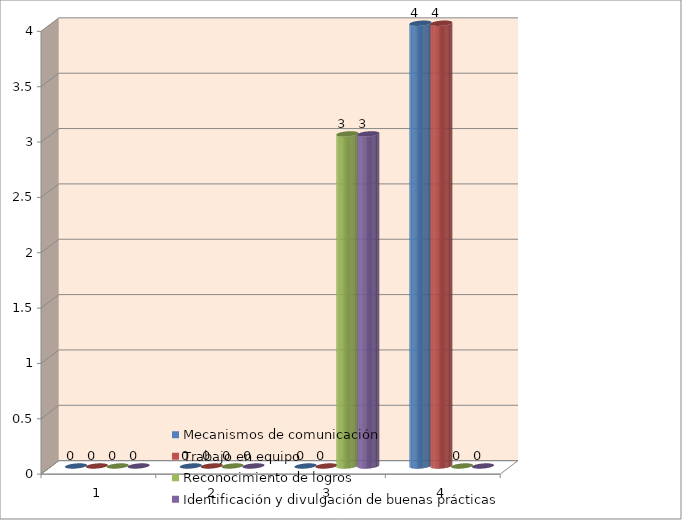
| Category | Mecanismos de comunicación | Trabajo en equipo | Reconocimiento de logros | Identificación y divulgación de buenas prácticas |
|---|---|---|---|---|
| 0 | 0 | 0 | 0 | 0 |
| 1 | 0 | 0 | 0 | 0 |
| 2 | 0 | 0 | 3 | 3 |
| 3 | 4 | 4 | 0 | 0 |